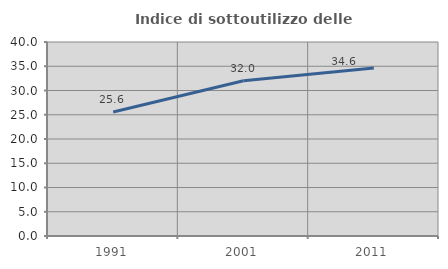
| Category | Indice di sottoutilizzo delle abitazioni  |
|---|---|
| 1991.0 | 25.581 |
| 2001.0 | 32 |
| 2011.0 | 34.633 |